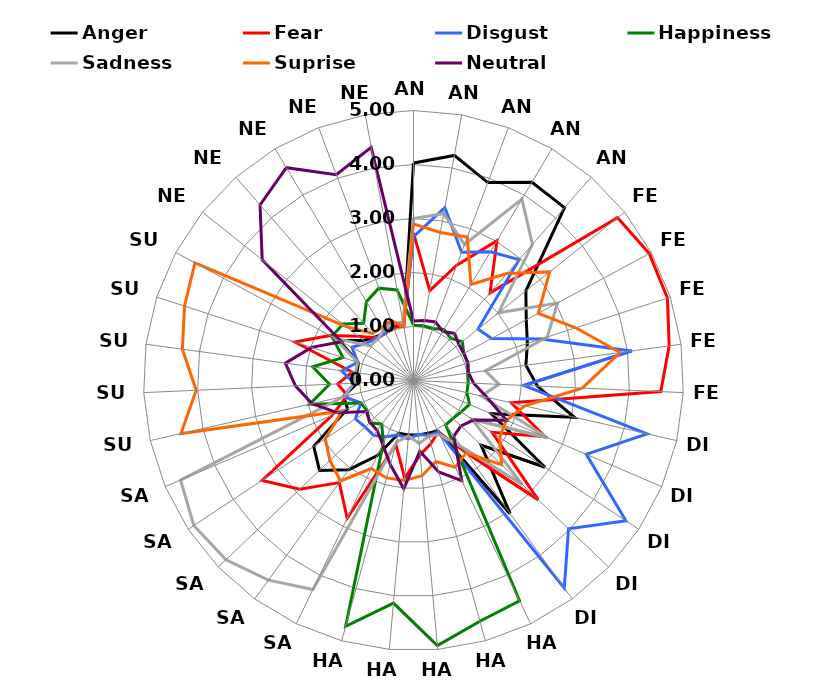
| Category | Anger | Fear | Disgust | Happiness | Sadness | Suprise | Neutral |
|---|---|---|---|---|---|---|---|
| AN | 4.028 | 2.732 | 2.662 | 1.028 | 3 | 2.901 | 1.1 |
| AN | 4.236 | 1.69 | 3.254 | 1.029 | 3.139 | 2.786 | 1.13 |
| AN | 3.915 | 2.282 | 2.535 | 1.029 | 2.69 | 2.838 | 1.157 |
| AN | 4.278 | 3.014 | 2.775 | 1.1 | 3.914 | 2.072 | 1.06 |
| AN | 4.25 | 2.155 | 2.972 | 1.043 | 3.347 | 2.629 | 1.157 |
| FE | 2.662 | 4.833 | 1.529 | 1.157 | 2.014 | 3.225 | 1.071 |
| FE | 2.371 | 4.958 | 1.643 | 1.058 | 3.028 | 2.623 | 1.057 |
| FE | 2.217 | 4.944 | 2.486 | 1.058 | 2.606 | 3.159 | 1.057 |
| FE | 2.1 | 4.778 | 4.083 | 1.014 | 1.343 | 3.859 | 1.029 |
| FE | 2.296 | 4.583 | 2.042 | 1.014 | 1.586 | 3.129 | 1.114 |
| DI | 3.057 | 1.857 | 4.437 | 1.014 | 1.286 | 2.116 | 1.394 |
| DI | 1.563 | 2.648 | 3.479 | 1.129 | 2.7 | 1.871 | 1.871 |
| DI | 2.914 | 1.743 | 4.714 | 1.057 | 1.3 | 1.913 | 1.329 |
| DI | 1.732 | 3.197 | 3.972 | 1.014 | 2.789 | 2.257 | 1.217 |
| DI | 3.042 | 1.643 | 4.75 | 1.014 | 1.529 | 1.657 | 1.271 |
| HA | 1.043 | 1.057 | 1.057 | 4.528 | 1.113 | 1.783 | 2.057 |
| HA | 1.014 | 1.211 | 1.057 | 4.625 | 1.071 | 1.557 | 1.757 |
| HA | 1.014 | 1.386 | 1 | 4.93 | 1.171 | 1.771 | 1.314 |
| HA | 1.014 | 1.814 | 1.087 | 4.139 | 1.029 | 1.857 | 2.014 |
| HA | 1.014 | 1.229 | 1.043 | 4.722 | 1.186 | 1.871 | 1.614 |
| SA | 1.543 | 2.831 | 1.157 | 1.29 | 4.296 | 1.809 | 1.314 |
| SA | 2.042 | 2.338 | 1.257 | 1 | 4.569 | 2.3 | 1.143 |
| SA | 2.408 | 2.915 | 1.243 | 1.129 | 4.803 | 2.143 | 1.116 |
| SA | 2.214 | 3.357 | 1.29 | 1.029 | 4.875 | 1.957 | 1.043 |
| SA | 1.329 | 1.638 | 1.06 | 1.058 | 4.69 | 1.435 | 1.522 |
| SU | 1.329 | 1.257 | 1.329 | 1.971 | 1.3 | 4.417 | 1.928 |
| SU | 1.043 | 1.406 | 1.1 | 1.557 | 1.114 | 4.028 | 2.188 |
| SU | 1.058 | 1.143 | 1.343 | 1.884 | 1.087 | 4.319 | 2.394 |
| SU | 1.071 | 2.31 | 1.086 | 1.373 | 1.086 | 4.458 | 1.986 |
| SU | 1.565 | 1.757 | 1.296 | 1.714 | 1.652 | 4.597 | 1.514 |
| NE | 1.186 | 1.314 | 1.114 | 1.676 | 1.029 | 1.609 | 3.583 |
| NE | 1.071 | 1.043 | 1.042 | 1.406 | 1.014 | 1.157 | 4.319 |
| NE | 1.014 | 1.029 | 1.014 | 1.7 | 1.085 | 1.143 | 4.592 |
| NE | 1.129 | 1.043 | 1.157 | 1.826 | 1.118 | 1.186 | 4.069 |
| NE | 1.014 | 1.043 | 1.029 | 1.704 | 1.1 | 1.014 | 4.389 |